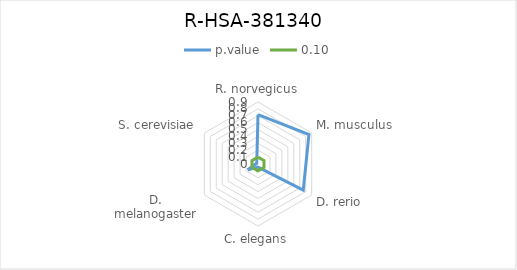
| Category | p.value | 0.10 |
|---|---|---|
| R. norvegicus | 0.717 | 0.1 |
| M. musculus | 0.854 | 0.1 |
| D. rerio | 0.758 | 0.1 |
| C. elegans | 0.046 | 0.1 |
| D. melanogaster | 0.171 | 0.1 |
| S. cerevisiae | 0.021 | 0.1 |